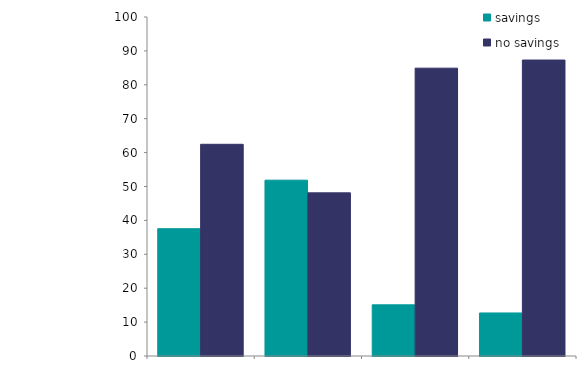
| Category | savings | no savings |
|---|---|---|
| one person | 37.55 | 62.45 |
| couple, 
no chidren | 51.869 | 48.131 |
| lone parent, 
dependent children | 15.092 | 84.908 |
| couple, 
dependent children | 12.695 | 87.305 |